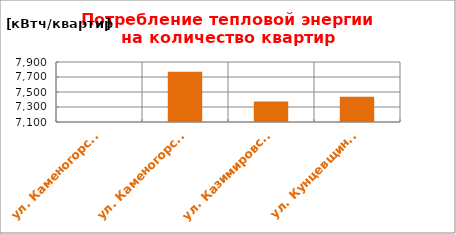
| Category | Series 0 |
|---|---|
| ул. Каменогорская, 30 | 0 |
| ул. Каменогорская, 86 | 7769.299 |
| ул. Казимировская, 9 | 7373.03 |
| ул. Кунцевщина, 35 | 7435.073 |